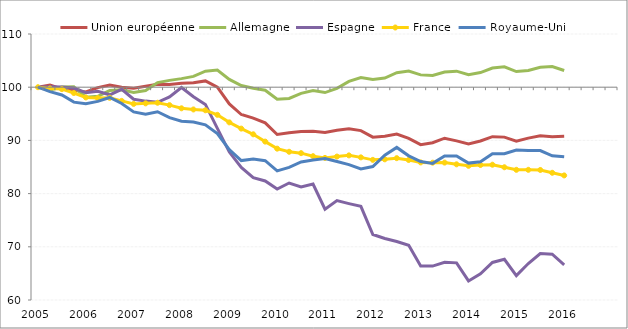
| Category | Union européenne | Allemagne | Espagne | France | Royaume-Uni |
|---|---|---|---|---|---|
| 2005 | 100 | 100 | 100 | 100 | 100 |
| 2005Q2 | 100.384 | 99.489 | 100.087 | 99.755 | 99.176 |
| 2005Q3 | 99.689 | 100.041 | 100.052 | 99.641 | 98.533 |
| 2005Q4 | 99.403 | 100.067 | 99.835 | 98.908 | 97.193 |
| 2006 | 99.11 | 98.126 | 98.96 | 98.077 | 96.885 |
| 2006Q2 | 99.926 | 98.282 | 99.245 | 97.959 | 97.334 |
| 2006Q3 | 100.408 | 99.374 | 98.573 | 98.002 | 98.073 |
| 2006Q4 | 99.981 | 99.503 | 99.597 | 97.43 | 96.948 |
| 2007 | 99.809 | 99.002 | 97.739 | 96.861 | 95.359 |
| 2007Q2 | 100.174 | 99.376 | 97.385 | 96.962 | 94.914 |
| 2007Q3 | 100.569 | 100.868 | 97.169 | 97.077 | 95.392 |
| 2007Q4 | 100.488 | 101.286 | 98.188 | 96.627 | 94.272 |
| 2008 | 100.722 | 101.614 | 99.941 | 96.033 | 93.612 |
| 2008Q2 | 100.849 | 102.029 | 98.215 | 95.817 | 93.47 |
| 2008Q3 | 101.179 | 103.019 | 96.761 | 95.66 | 92.933 |
| 2008Q4 | 99.997 | 103.23 | 92.271 | 94.807 | 91.277 |
| 2009 | 96.862 | 101.472 | 87.807 | 93.389 | 88.247 |
| 2009Q2 | 94.867 | 100.313 | 84.93 | 92.215 | 86.207 |
| 2009Q3 | 94.191 | 99.791 | 83.013 | 91.147 | 86.5 |
| 2009Q4 | 93.303 | 99.432 | 82.375 | 89.775 | 86.189 |
| 2010 | 91.108 | 97.735 | 80.857 | 88.448 | 84.276 |
| 2010Q2 | 91.455 | 97.878 | 81.989 | 87.863 | 84.924 |
| 2010Q3 | 91.693 | 98.832 | 81.251 | 87.604 | 85.939 |
| 2010Q4 | 91.731 | 99.362 | 81.787 | 87.032 | 86.327 |
| 2011 | 91.47 | 98.989 | 77.078 | 86.709 | 86.586 |
| 2011Q2 | 91.924 | 99.777 | 78.676 | 86.959 | 86.047 |
| 2011Q3 | 92.167 | 101.085 | 78.121 | 87.185 | 85.445 |
| 2011Q4 | 91.842 | 101.831 | 77.603 | 86.812 | 84.628 |
| 2012 | 90.615 | 101.429 | 72.308 | 86.342 | 85.079 |
| 2012Q2 | 90.799 | 101.719 | 71.554 | 86.444 | 87.222 |
| 2012Q3 | 91.179 | 102.725 | 70.998 | 86.662 | 88.679 |
| 2012Q4 | 90.365 | 103.024 | 70.275 | 86.318 | 87.099 |
| 2013 | 89.198 | 102.316 | 66.375 | 85.864 | 86.033 |
| 2013Q2 | 89.566 | 102.216 | 66.373 | 85.813 | 85.684 |
| 2013Q3 | 90.414 | 102.867 | 67.074 | 85.828 | 87.085 |
| 2013Q4 | 89.91 | 103.016 | 66.982 | 85.505 | 87.056 |
| 2014 | 89.319 | 102.346 | 63.582 | 85.224 | 85.736 |
| 2014Q2 | 89.888 | 102.746 | 64.928 | 85.379 | 85.983 |
| 2014Q3 | 90.705 | 103.592 | 67.055 | 85.429 | 87.482 |
| 2014Q4 | 90.617 | 103.839 | 67.649 | 84.952 | 87.485 |
| 2015 | 89.849 | 102.94 | 64.574 | 84.47 | 88.184 |
| 2015Q2 | 90.429 | 103.151 | 66.855 | 84.472 | 88.096 |
| 2015Q3 | 90.862 | 103.734 | 68.736 | 84.445 | 88.091 |
| 2015Q4 | 90.691 | 103.894 | 68.602 | 83.912 | 87.098 |
| 2016 | 90.766 | 103.131 | 66.594 | 83.416 | 86.929 |